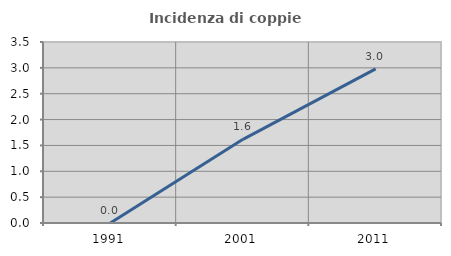
| Category | Incidenza di coppie miste |
|---|---|
| 1991.0 | 0 |
| 2001.0 | 1.618 |
| 2011.0 | 2.98 |